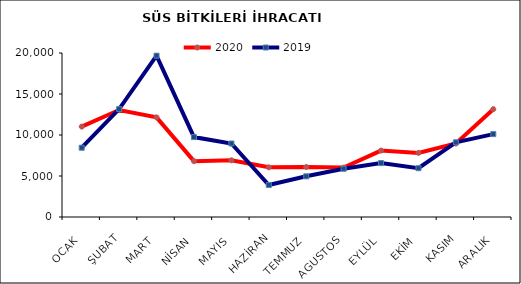
| Category | 2020 | 2019 |
|---|---|---|
| OCAK | 11024.011 | 8448.146 |
| ŞUBAT | 13044.34 | 13159.616 |
| MART | 12149.519 | 19671.061 |
| NİSAN | 6813.295 | 9745.644 |
| MAYIS | 6914.245 | 8965.007 |
| HAZİRAN | 6061.073 | 3904.749 |
| TEMMUZ | 6099.33 | 4960.364 |
| AGUSTOS | 6022.598 | 5881.662 |
| EYLÜL | 8099.631 | 6573.872 |
| EKİM | 7819.841 | 5953.315 |
| KASIM | 8959.74 | 9107.072 |
| ARALIK | 13149.085 | 10109.133 |